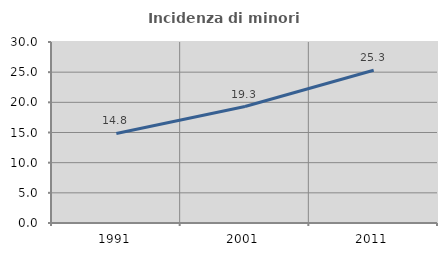
| Category | Incidenza di minori stranieri |
|---|---|
| 1991.0 | 14.844 |
| 2001.0 | 19.306 |
| 2011.0 | 25.328 |